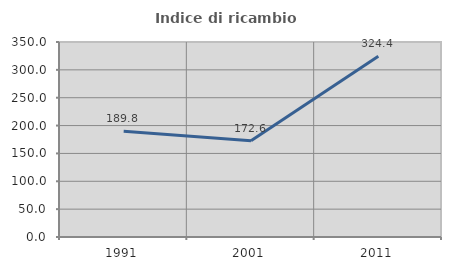
| Category | Indice di ricambio occupazionale  |
|---|---|
| 1991.0 | 189.831 |
| 2001.0 | 172.581 |
| 2011.0 | 324.444 |